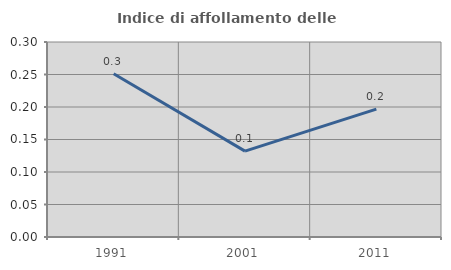
| Category | Indice di affollamento delle abitazioni  |
|---|---|
| 1991.0 | 0.251 |
| 2001.0 | 0.132 |
| 2011.0 | 0.197 |